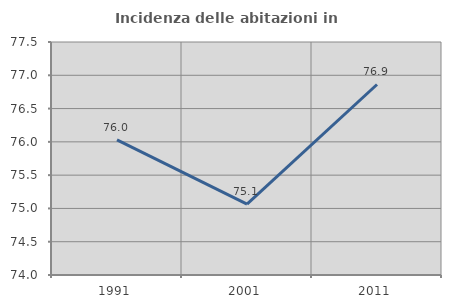
| Category | Incidenza delle abitazioni in proprietà  |
|---|---|
| 1991.0 | 76.031 |
| 2001.0 | 75.064 |
| 2011.0 | 76.862 |